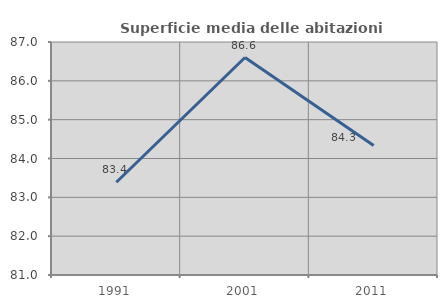
| Category | Superficie media delle abitazioni occupate |
|---|---|
| 1991.0 | 83.389 |
| 2001.0 | 86.6 |
| 2011.0 | 84.333 |